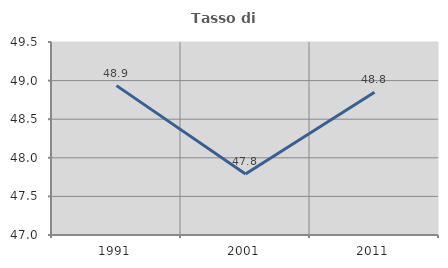
| Category | Tasso di occupazione   |
|---|---|
| 1991.0 | 48.935 |
| 2001.0 | 47.79 |
| 2011.0 | 48.849 |